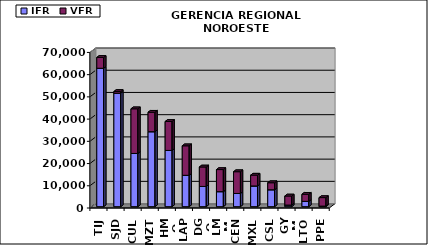
| Category | IFR | VFR |
|---|---|---|
| TIJ | 62281 | 4865 |
| SJD | 51078 | 737 |
| CUL | 23940 | 20100 |
| MZT | 33739 | 8745 |
| HMO | 25306 | 13026 |
| LAP | 14115 | 13278 |
| DGO | 9110 | 8752 |
| LMM | 6759 | 9932 |
| CEN | 5940 | 9797 |
| MXL | 9329 | 4855 |
| CSL | 7620 | 3156 |
| GYM | 731 | 4072 |
| LTO | 2409 | 3172 |
| PPE | 259 | 3824 |